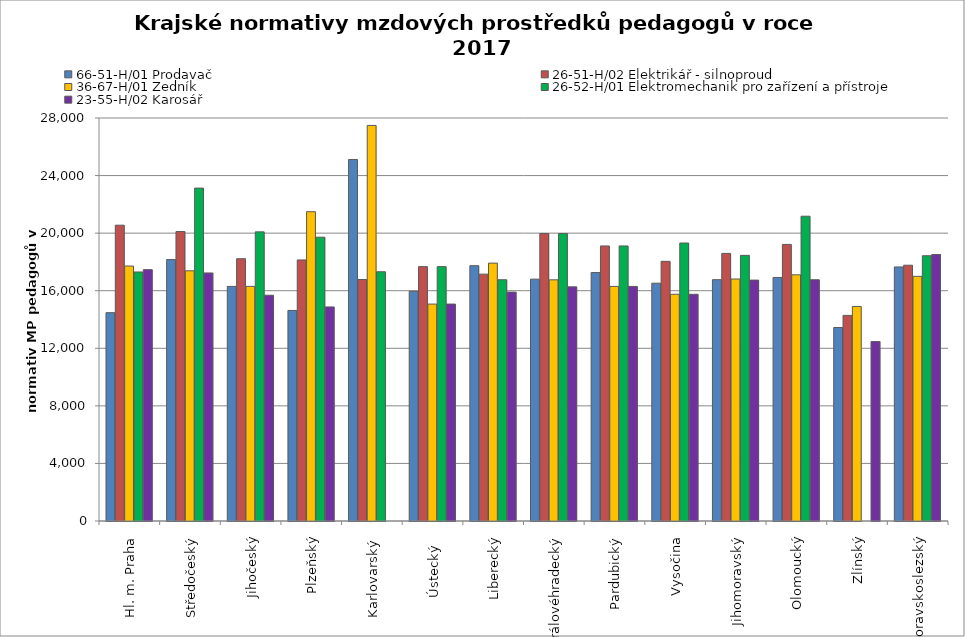
| Category | 66-51-H/01 Prodavač | 26-51-H/02 Elektrikář - silnoproud | 36-67-H/01 Zedník | 26-52-H/01 Elektromechanik pro zařízení a přístroje | 23-55-H/02 Karosář |
|---|---|---|---|---|---|
| Hl. m. Praha | 14474.708 | 20552.486 | 17714.286 | 17302.326 | 17464.789 |
| Středočeský | 18163.377 | 20111.525 | 17384.117 | 23128.254 | 17234.897 |
| Jihočeský | 16299.915 | 18223.456 | 16300.914 | 20089.093 | 15687.949 |
| Plzeňský | 14628.907 | 18138.708 | 21488.838 | 19718.902 | 14873.596 |
| Karlovarský  | 25114.223 | 16779.911 | 27483.871 | 17317.073 | 0 |
| Ústecký   | 15961.826 | 17672.894 | 15072.355 | 17672.894 | 15072.355 |
| Liberecký | 17736.912 | 17151.024 | 17917.705 | 16760.871 | 15902.231 |
| Královéhradecký | 16803.387 | 19968.698 | 16756.098 | 19968.698 | 16267.76 |
| Pardubický | 17261.944 | 19110.438 | 16298.524 | 19110.438 | 16298.524 |
| Vysočina | 16523.064 | 18040.894 | 15753.019 | 19313.697 | 15753.019 |
| Jihomoravský | 16768.024 | 18592.243 | 16812.125 | 18455.992 | 16735.827 |
| Olomoucký | 16920.322 | 19217.082 | 17104.072 | 21176.471 | 16762.749 |
| Zlínský | 13444.235 | 14284.5 | 14905.565 | 0 | 12466.473 |
| Moravskoslezský | 17651.464 | 17770.904 | 16998.613 | 18430.075 | 18513.595 |